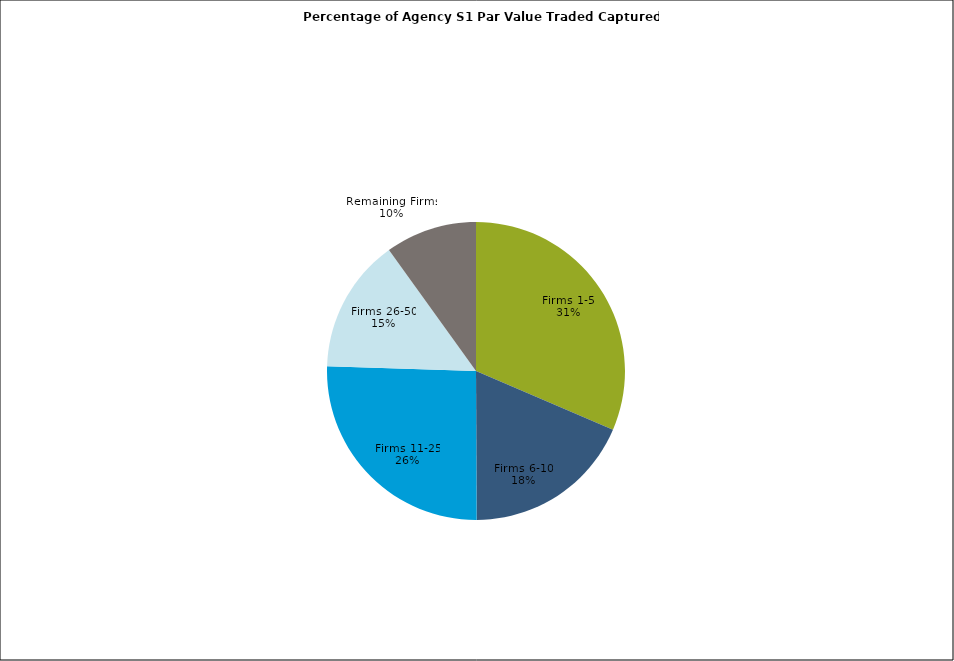
| Category | Series 0 |
|---|---|
| Firms 1-5 | 0.314 |
| Firms 6-10 | 0.185 |
| Firms 11-25 | 0.256 |
| Firms 26-50 | 0.146 |
| Remaining Firms | 0.099 |